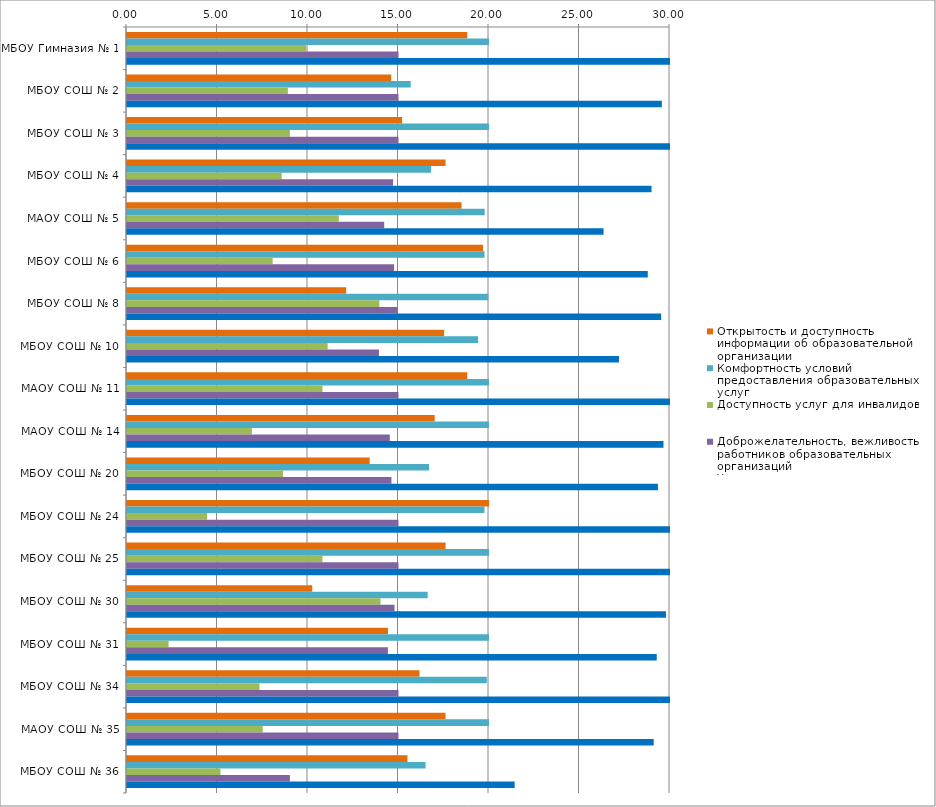
| Category | Открытость и доступность информации об образовательной организации | Комфортность условий предоставления образовательных услуг | Доступность услуг для инвалидов | Доброжелательность, вежливость работников образовательных организаций | Удовлетворенность условиями оказания услуг |
|---|---|---|---|---|---|
| МБОУ Гимназия № 1 | 18.8 | 20 | 9.9 | 15 | 30 |
| МБОУ СОШ № 2 | 14.6 | 15.675 | 8.888 | 15 | 29.55 |
| МБОУ СОШ № 3 | 15.2 | 20 | 9 | 15 | 30 |
| МБОУ СОШ № 4 | 17.6 | 16.8 | 8.55 | 14.7 | 28.98 |
| МАОУ СОШ № 5 | 18.484 | 19.763 | 11.704 | 14.211 | 26.329 |
| МБОУ СОШ № 6 | 19.672 | 19.754 | 8.048 | 14.754 | 28.771 |
| МБОУ СОШ № 8 | 12.107 | 19.965 | 13.943 | 14.948 | 29.512 |
| МБОУ СОШ № 10 | 17.52 | 19.4 | 11.085 | 13.92 | 27.18 |
| МАОУ СОШ № 11 | 18.8 | 20 | 10.8 | 15 | 30 |
| МАОУ СОШ № 14 | 17 | 20 | 6.9 | 14.52 | 29.64 |
| МБОУ СОШ № 20 | 13.407 | 16.689 | 8.617 | 14.611 | 29.333 |
| МБОУ СОШ № 24 | 20 | 19.752 | 4.426 | 15 | 30 |
| МБОУ СОШ № 25 | 17.6 | 20 | 10.8 | 15 | 30 |
| МБОУ СОШ № 30 | 10.233 | 16.612 | 14.006 | 14.781 | 29.781 |
| МБОУ СОШ № 31 | 14.42 | 20 | 2.298 | 14.415 | 29.268 |
| МБОУ СОШ № 34 | 16.16 | 19.88 | 7.32 | 15 | 30 |
| МАОУ СОШ № 35 | 17.6 | 20 | 7.5 | 15 | 29.1 |
| МБОУ СОШ № 36 | 15.496 | 16.496 | 5.161 | 9 | 21.418 |